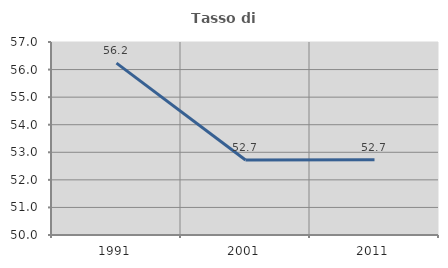
| Category | Tasso di occupazione   |
|---|---|
| 1991.0 | 56.234 |
| 2001.0 | 52.722 |
| 2011.0 | 52.729 |